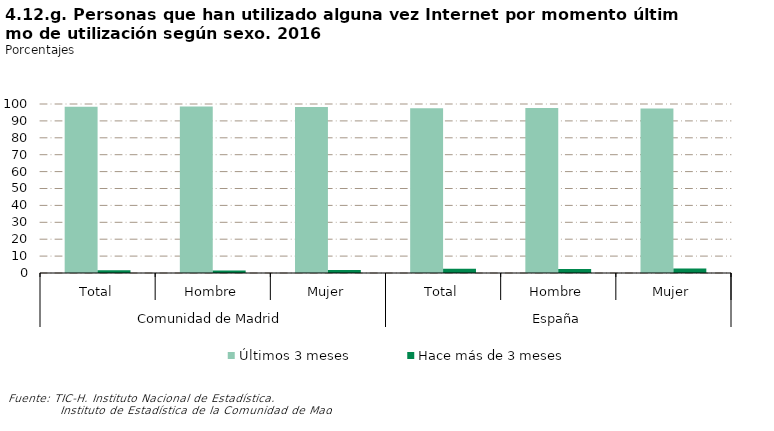
| Category | Últimos 3 meses | Hace más de 3 meses |
|---|---|---|
| 0 | 98.352 | 1.648 |
| 1 | 98.542 | 1.458 |
| 2 | 98.163 | 1.837 |
| 3 | 97.435 | 2.565 |
| 4 | 97.598 | 2.402 |
| 5 | 97.265 | 2.735 |